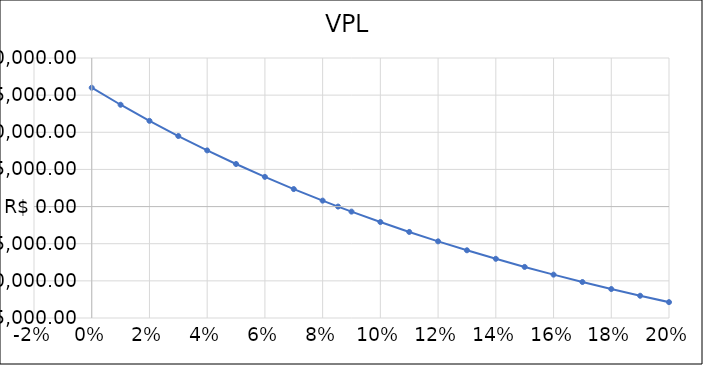
| Category | VPL |
|---|---|
| 0.0 | 16000 |
| 0.01 | 13707.009 |
| 0.02 | 11541.929 |
| 0.03 | 9496.138 |
| 0.04 | 7561.685 |
| 0.05 | 5731.228 |
| 0.06 | 3997.988 |
| 0.07 | 2355.693 |
| 0.08 | 798.54 |
| 0.08534 | 0.017 |
| 0.09 | -678.845 |
| 0.1 | -2081.444 |
| 0.11 | -3413.878 |
| 0.12 | -4680.439 |
| 0.13 | -5885.111 |
| 0.14 | -7031.601 |
| 0.15 | -8123.358 |
| 0.16 | -9163.592 |
| 0.17 | -10155.295 |
| 0.18 | -11101.256 |
| 0.19 | -12004.078 |
| 0.2 | -12866.191 |